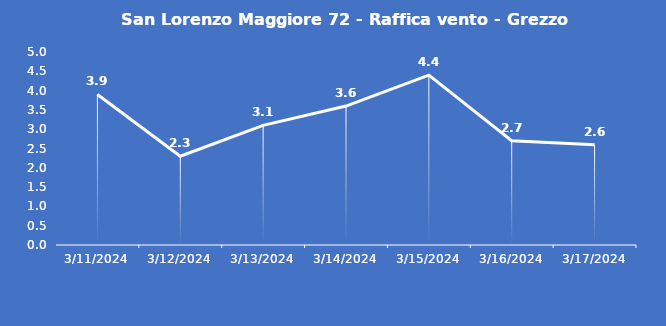
| Category | San Lorenzo Maggiore 72 - Raffica vento - Grezzo (m/s) |
|---|---|
| 3/11/24 | 3.9 |
| 3/12/24 | 2.3 |
| 3/13/24 | 3.1 |
| 3/14/24 | 3.6 |
| 3/15/24 | 4.4 |
| 3/16/24 | 2.7 |
| 3/17/24 | 2.6 |